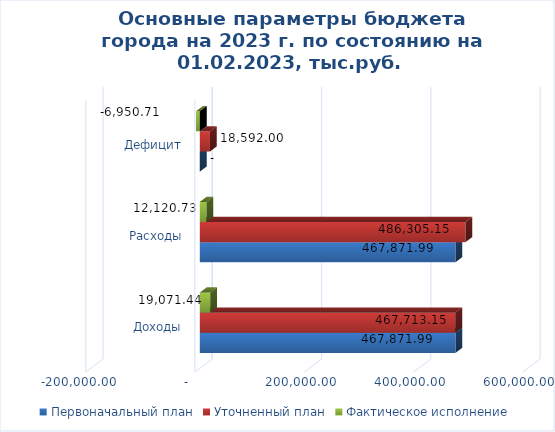
| Category | Первоначальный план | Уточненный план | Фактическое исполнение |
|---|---|---|---|
| Доходы | 467871.99 | 467713.15 | 19071.44 |
| Расходы | 467871.99 | 486305.15 | 12120.73 |
| Дефицит | 0 | 18592 | -6950.71 |